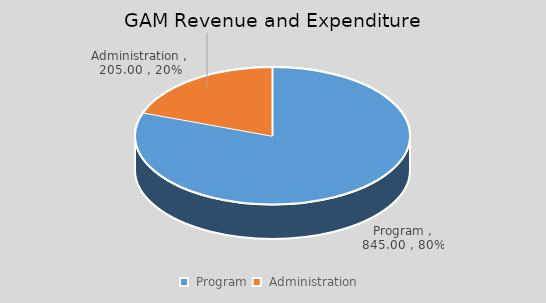
| Category | Series 0 |
|---|---|
| Program | 845 |
| Administration | 205 |